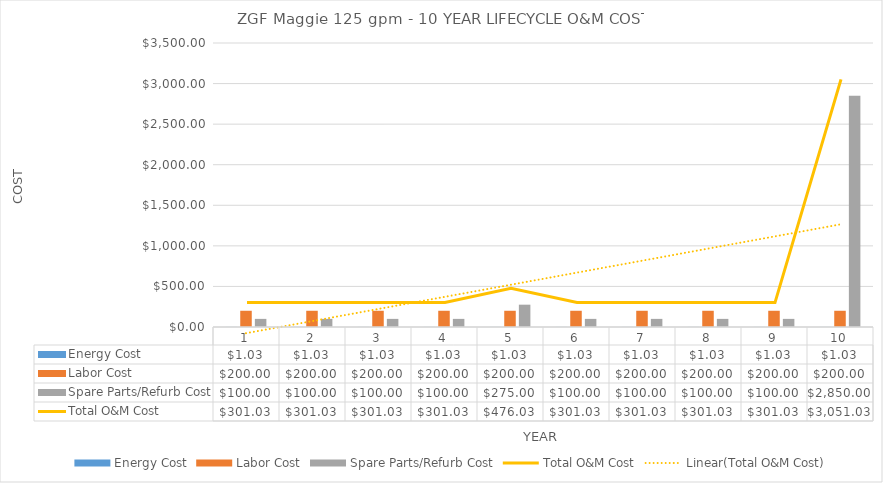
| Category | Energy Cost | Labor Cost | Spare Parts/Refurb Cost |
|---|---|---|---|
| 0 | 1.026 | 200 | 100 |
| 1 | 1.026 | 200 | 100 |
| 2 | 1.026 | 200 | 100 |
| 3 | 1.026 | 200 | 100 |
| 4 | 1.026 | 200 | 275 |
| 5 | 1.026 | 200 | 100 |
| 6 | 1.026 | 200 | 100 |
| 7 | 1.026 | 200 | 100 |
| 8 | 1.026 | 200 | 100 |
| 9 | 1.026 | 200 | 2850 |